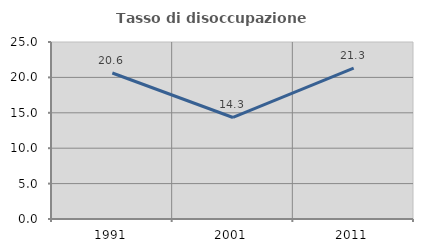
| Category | Tasso di disoccupazione giovanile  |
|---|---|
| 1991.0 | 20.62 |
| 2001.0 | 14.34 |
| 2011.0 | 21.316 |